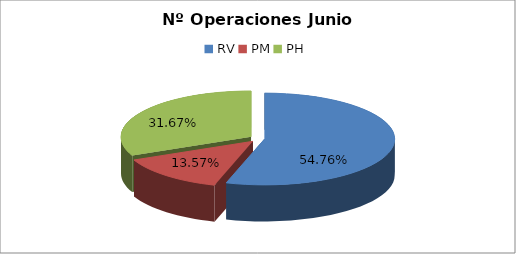
| Category | Series 0 |
|---|---|
| RV | 17491 |
| PM | 4335 |
| PH | 10117 |